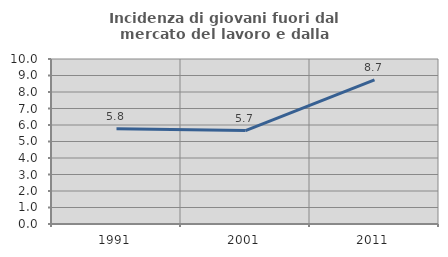
| Category | Incidenza di giovani fuori dal mercato del lavoro e dalla formazione  |
|---|---|
| 1991.0 | 5.779 |
| 2001.0 | 5.662 |
| 2011.0 | 8.74 |